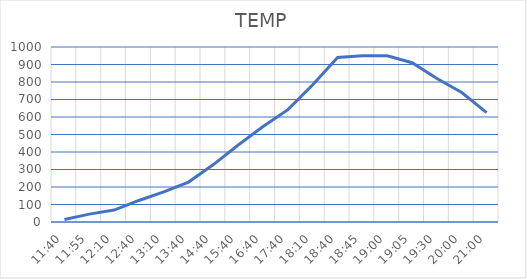
| Category | TEMP |
|---|---|
| 0.4861111111111111 | 14 |
| 0.49652777777777773 | 45 |
| 0.5069444444444444 | 68 |
| 0.5277777777777778 | 123 |
| 0.548611111111111 | 172 |
| 0.5694444444444444 | 228 |
| 0.611111111111111 | 328 |
| 0.6527777777777778 | 440 |
| 0.6944444444444445 | 546 |
| 0.7361111111111112 | 642 |
| 0.7569444444444445 | 784 |
| 0.7777777777777778 | 940 |
| 0.78125 | 950 |
| 0.7916666666666666 | 950 |
| 0.7951388888888888 | 910 |
| 0.8125 | 820 |
| 0.8333333333333334 | 740 |
| 0.875 | 625 |